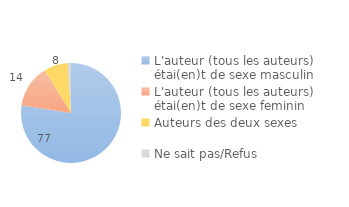
| Category | Series 0 |
|---|---|
| L'auteur (tous les auteurs) étai(en)t de sexe masculin | 77.459 |
| L'auteur (tous les auteurs) étai(en)t de sexe feminin | 13.757 |
| Auteurs des deux sexes | 7.725 |
| Ne sait pas/Refus | 1.059 |